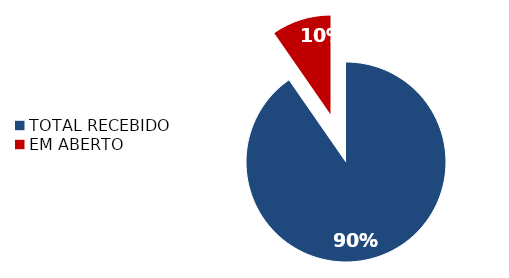
| Category | Series 0 |
|---|---|
| TOTAL RECEBIDO | 889 |
| EM ABERTO | 95 |